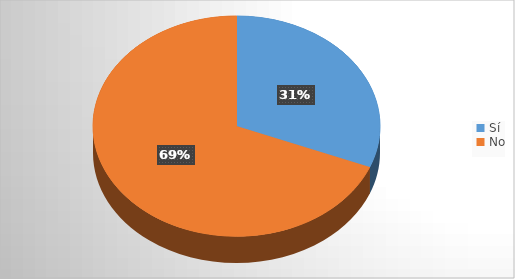
| Category | Series 0 |
|---|---|
| Sí | 32 |
| No | 71 |